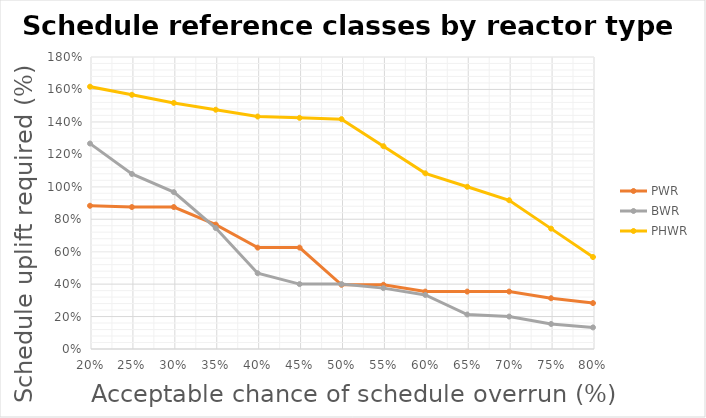
| Category | PWR | BWR | PHWR |
|---|---|---|---|
| 0.8 | 0.283 | 0.133 | 0.567 |
| 0.75 | 0.313 | 0.154 | 0.742 |
| 0.7 | 0.354 | 0.2 | 0.917 |
| 0.65 | 0.354 | 0.213 | 1 |
| 0.6 | 0.354 | 0.333 | 1.083 |
| 0.55 | 0.396 | 0.375 | 1.25 |
| 0.5 | 0.396 | 0.4 | 1.417 |
| 0.45 | 0.625 | 0.4 | 1.425 |
| 0.399999999999999 | 0.625 | 0.467 | 1.433 |
| 0.349999999999999 | 0.767 | 0.746 | 1.475 |
| 0.299999999999999 | 0.875 | 0.967 | 1.517 |
| 0.249999999999999 | 0.875 | 1.079 | 1.567 |
| 0.199999999999999 | 0.883 | 1.267 | 1.617 |